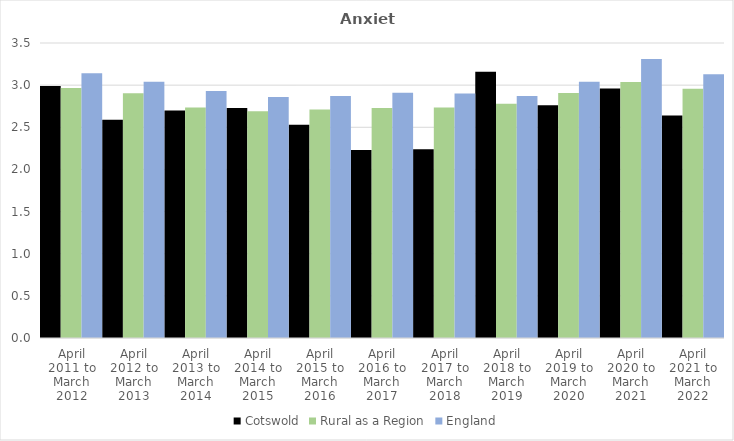
| Category | Cotswold | Rural as a Region | England |
|---|---|---|---|
| April 2011 to March 2012 | 2.99 | 2.967 | 3.14 |
| April 2012 to March 2013 | 2.59 | 2.904 | 3.04 |
| April 2013 to March 2014 | 2.7 | 2.734 | 2.93 |
| April 2014 to March 2015 | 2.73 | 2.691 | 2.86 |
| April 2015 to March 2016 | 2.53 | 2.711 | 2.87 |
| April 2016 to March 2017 | 2.23 | 2.729 | 2.91 |
| April 2017 to March 2018 | 2.24 | 2.736 | 2.9 |
| April 2018 to March 2019 | 3.16 | 2.78 | 2.87 |
| April 2019 to March 2020 | 2.76 | 2.908 | 3.04 |
| April 2020 to March 2021 | 2.96 | 3.036 | 3.31 |
| April 2021 to March 2022 | 2.64 | 2.956 | 3.13 |